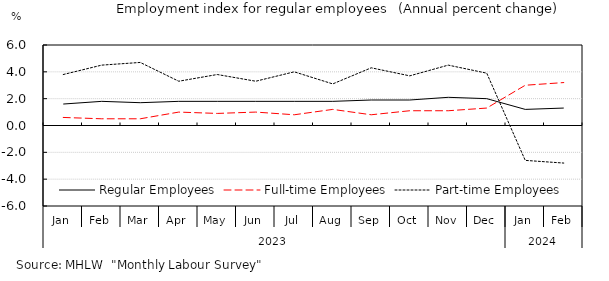
| Category | Regular Employees | Full-time Employees | Part-time Employees |
|---|---|---|---|
| 0 | 1.6 | 0.6 | 3.8 |
| 1 | 1.8 | 0.5 | 4.5 |
| 2 | 1.7 | 0.5 | 4.7 |
| 3 | 1.8 | 1 | 3.3 |
| 4 | 1.8 | 0.9 | 3.8 |
| 5 | 1.8 | 1 | 3.3 |
| 6 | 1.8 | 0.8 | 4 |
| 7 | 1.8 | 1.2 | 3.1 |
| 8 | 1.9 | 0.8 | 4.3 |
| 9 | 1.9 | 1.1 | 3.7 |
| 10 | 2.1 | 1.1 | 4.5 |
| 11 | 2 | 1.3 | 3.9 |
| 12 | 1.2 | 3 | -2.6 |
| 13 | 1.3 | 3.2 | -2.8 |